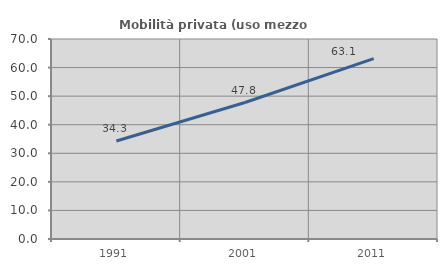
| Category | Mobilità privata (uso mezzo privato) |
|---|---|
| 1991.0 | 34.316 |
| 2001.0 | 47.774 |
| 2011.0 | 63.107 |